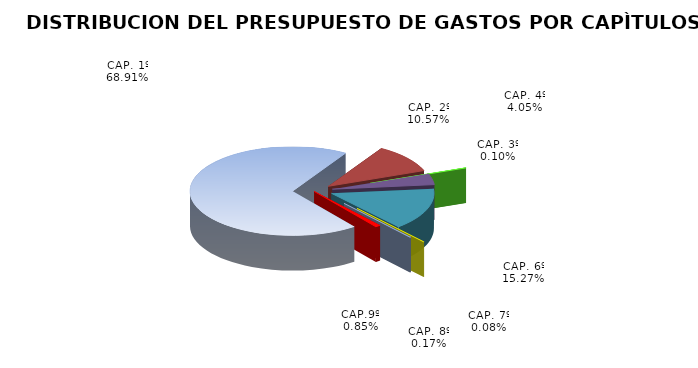
| Category | Series 1 | Año 2017 |
|---|---|---|
| CAP. 1º | 269404548.06 | 269404548.06 |
| CAP. 2º | 41337458.851 | 42956988.545 |
| CAP. 3º | 400000 | 400000 |
| CAP. 4º | 15830728.03 | 16518478.03 |
| CAP. 6º | 59695290.501 | 57407843 |
| CAP. 7º | 318213 | 318213 |
| CAP. 8º | 650000 | 650000 |
| CAP.9º | 3314121.56 | 3314121.56 |